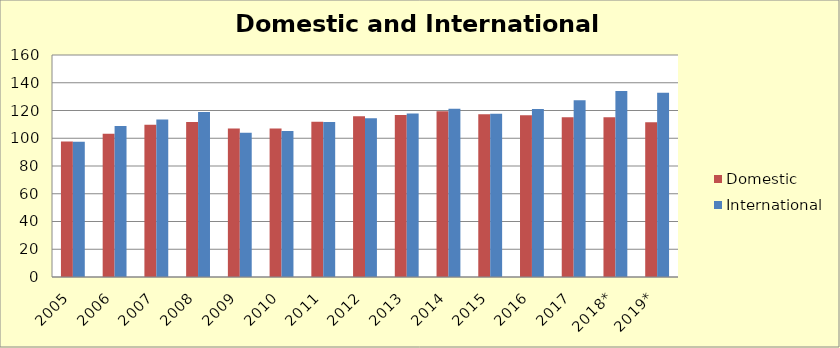
| Category | Domestic | International |
|---|---|---|
| 2005 | 97.608 | 97.547 |
| 2006 | 103.286 | 108.801 |
| 2007 | 109.672 | 113.576 |
| 2008 | 111.631 | 118.863 |
| 2009 | 107.08 | 103.923 |
| 2010 | 107.063 | 105.181 |
| 2011 | 111.883 | 111.652 |
| 2012 | 115.822 | 114.471 |
| 2013 | 116.729 | 117.905 |
| 2014 | 119.471 | 121.199 |
| 2015 | 117.348 | 117.63 |
| 2016 | 116.642 | 121.103 |
| 2017 | 115.1 | 127.455 |
| 2018* | 115.187 | 134.099 |
| 2019* | 111.524 | 132.824 |